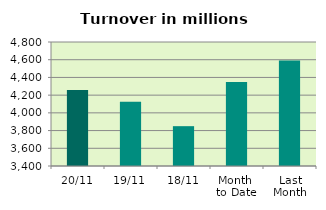
| Category | Series 0 |
|---|---|
| 20/11 | 4257.576 |
| 19/11 | 4125.702 |
| 18/11 | 3849.725 |
| Month 
to Date | 4347.218 |
| Last
Month | 4589.98 |